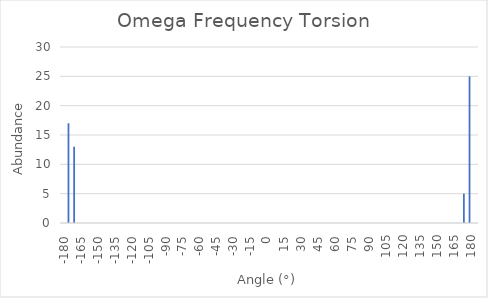
| Category | Series 0 |
|---|---|
| -180.0 | 0 |
| -175.0 | 17 |
| -170.0 | 13 |
| -165.0 | 0 |
| -160.0 | 0 |
| -155.0 | 0 |
| -150.0 | 0 |
| -145.0 | 0 |
| -140.0 | 0 |
| -135.0 | 0 |
| -130.0 | 0 |
| -125.0 | 0 |
| -120.0 | 0 |
| -115.0 | 0 |
| -110.0 | 0 |
| -105.0 | 0 |
| -100.0 | 0 |
| -95.0 | 0 |
| -90.0 | 0 |
| -85.0 | 0 |
| -80.0 | 0 |
| -75.0 | 0 |
| -70.0 | 0 |
| -65.0 | 0 |
| -60.0 | 0 |
| -55.0 | 0 |
| -50.0 | 0 |
| -45.0 | 0 |
| -40.0 | 0 |
| -35.0 | 0 |
| -30.0 | 0 |
| -25.0 | 0 |
| -20.0 | 0 |
| -15.0 | 0 |
| -10.0 | 0 |
| -5.0 | 0 |
| 0.0 | 0 |
| 5.0 | 0 |
| 10.0 | 0 |
| 15.0 | 0 |
| 20.0 | 0 |
| 25.0 | 0 |
| 30.0 | 0 |
| 35.0 | 0 |
| 40.0 | 0 |
| 45.0 | 0 |
| 50.0 | 0 |
| 55.0 | 0 |
| 60.0 | 0 |
| 65.0 | 0 |
| 70.0 | 0 |
| 75.0 | 0 |
| 80.0 | 0 |
| 85.0 | 0 |
| 90.0 | 0 |
| 95.0 | 0 |
| 100.0 | 0 |
| 105.0 | 0 |
| 110.0 | 0 |
| 115.0 | 0 |
| 120.0 | 0 |
| 125.0 | 0 |
| 130.0 | 0 |
| 135.0 | 0 |
| 140.0 | 0 |
| 145.0 | 0 |
| 150.0 | 0 |
| 155.0 | 0 |
| 160.0 | 0 |
| 165.0 | 0 |
| 170.0 | 0 |
| 175.0 | 5 |
| 180.0 | 25 |